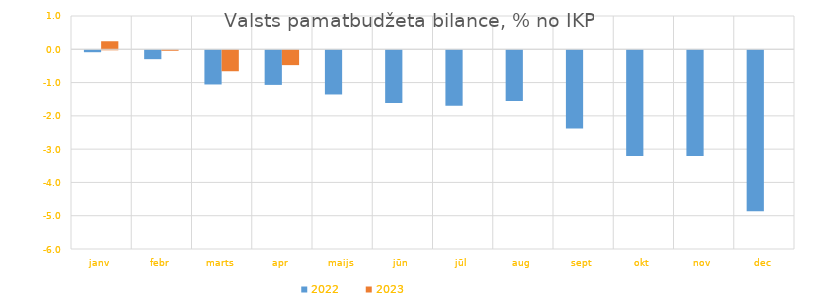
| Category | 2022 | 2023 |
|---|---|---|
| janv | -0.058 | 0.241 |
| febr | -0.267 | -0.014 |
| marts | -1.027 | -0.629 |
| apr | -1.04 | -0.446 |
| maijs | -1.328 | 0 |
| jūn | -1.587 | 0 |
| jūl | -1.669 | 0 |
| aug | -1.525 | 0 |
| sept | -2.352 | 0 |
| okt | -3.179 | 0 |
| nov | -3.173 | 0 |
| dec | -4.834 | 0 |